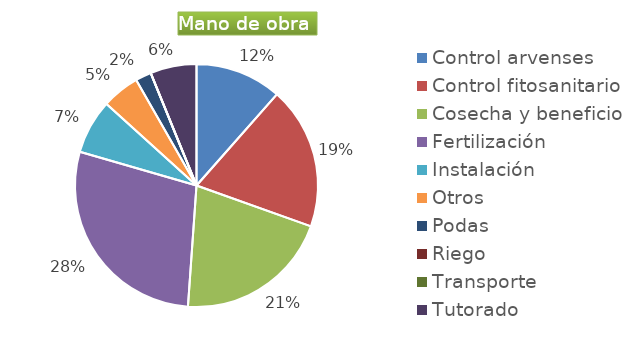
| Category | Series 0 |
|---|---|
| Control arvenses | 4380132 |
| Control fitosanitario | 7217964 |
| Cosecha y beneficio | 7872000 |
| Fertilización | 10796100 |
| Instalación | 2758924 |
| Otros | 1912452 |
| Podas | 801996 |
| Riego | 0 |
| Transporte | 0 |
| Tutorado | 2344296 |